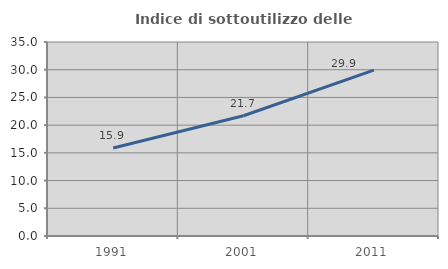
| Category | Indice di sottoutilizzo delle abitazioni  |
|---|---|
| 1991.0 | 15.864 |
| 2001.0 | 21.693 |
| 2011.0 | 29.925 |